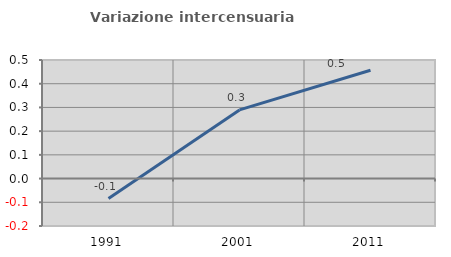
| Category | Variazione intercensuaria annua |
|---|---|
| 1991.0 | -0.084 |
| 2001.0 | 0.29 |
| 2011.0 | 0.457 |